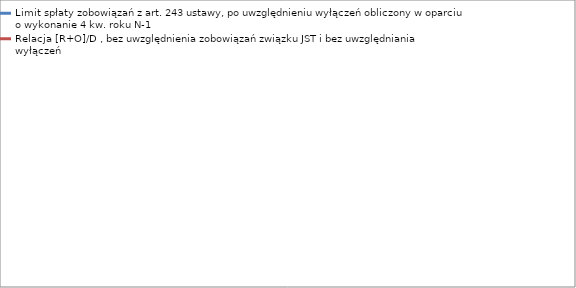
| Category | Limit spłaty zobowiązań z art. 243 ustawy, po uwzględnieniu wyłączeń obliczony w oparciu o wykonanie 4 kw. roku N-1 | Relacja [R+O]/D , bez uwzględnienia zobowiązań związku JST i bez uwzględniania wyłączeń |
|---|---|---|
| 2014.0 | 0.177 | 0.058 |
| 2015.0 | 0.207 | 0 |
| 2016.0 | 0.172 | 0 |
| 2017.0 | 0.188 | 0 |